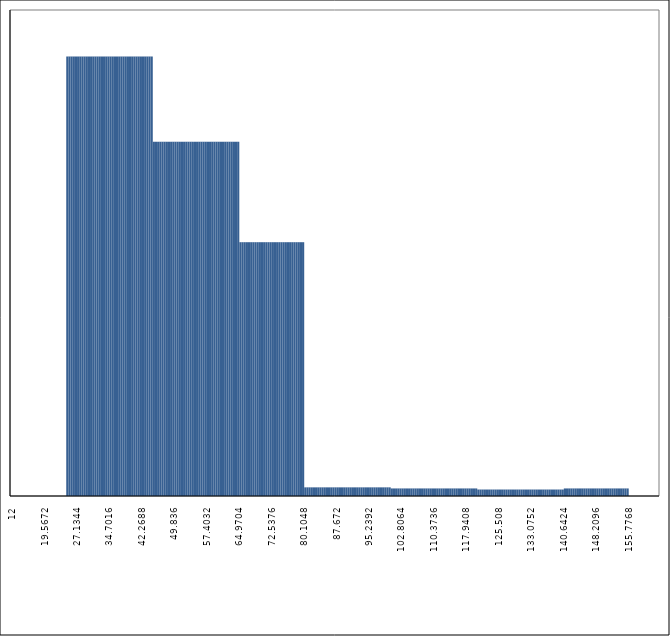
| Category | Series 0 |
|---|---|
| 12.0 | 0 |
| 12.504480000000001 | 0 |
| 13.008960000000002 | 0 |
| 13.513440000000003 | 0 |
| 14.017920000000004 | 0 |
| 14.522400000000005 | 0 |
| 15.026880000000006 | 0 |
| 15.531360000000006 | 0 |
| 16.035840000000007 | 0 |
| 16.54032000000001 | 0 |
| 17.04480000000001 | 0 |
| 17.54928000000001 | 0 |
| 18.05376000000001 | 0 |
| 18.558240000000012 | 0 |
| 19.062720000000013 | 0 |
| 19.567200000000014 | 0 |
| 20.071680000000015 | 0 |
| 20.576160000000016 | 0 |
| 21.080640000000017 | 0 |
| 21.585120000000018 | 0 |
| 22.08960000000002 | 0 |
| 22.59408000000002 | 0 |
| 23.09856000000002 | 0 |
| 23.60304000000002 | 0 |
| 24.107520000000022 | 0 |
| 24.612000000000023 | 0 |
| 25.116480000000024 | 0.407 |
| 25.620960000000025 | 0.407 |
| 26.125440000000026 | 0.407 |
| 26.629920000000027 | 0.407 |
| 27.134400000000028 | 0.407 |
| 27.63888000000003 | 0.407 |
| 28.14336000000003 | 0.407 |
| 28.64784000000003 | 0.407 |
| 29.15232000000003 | 0.407 |
| 29.656800000000032 | 0.407 |
| 30.161280000000033 | 0.407 |
| 30.665760000000034 | 0.407 |
| 31.170240000000035 | 0.407 |
| 31.674720000000036 | 0.407 |
| 32.17920000000004 | 0.407 |
| 32.68368000000004 | 0.407 |
| 33.18816000000004 | 0.407 |
| 33.69264000000004 | 0.407 |
| 34.19712000000004 | 0.407 |
| 34.70160000000004 | 0.407 |
| 35.20608000000004 | 0.407 |
| 35.710560000000044 | 0.407 |
| 36.215040000000045 | 0.407 |
| 36.719520000000045 | 0.407 |
| 37.224000000000046 | 0.407 |
| 37.72848000000005 | 0.407 |
| 38.23296000000005 | 0.407 |
| 38.73744000000005 | 0.407 |
| 39.24192000000005 | 0.407 |
| 39.74640000000005 | 0.407 |
| 40.25088000000005 | 0.407 |
| 40.75536000000005 | 0.407 |
| 41.259840000000054 | 0.407 |
| 41.764320000000055 | 0.407 |
| 42.268800000000056 | 0.407 |
| 42.77328000000006 | 0.407 |
| 43.27776000000006 | 0.407 |
| 43.78224000000006 | 0.407 |
| 44.28672000000006 | 0.407 |
| 44.79120000000006 | 0.407 |
| 45.29568000000006 | 0.328 |
| 45.80016000000006 | 0.328 |
| 46.30464000000006 | 0.328 |
| 46.809120000000064 | 0.328 |
| 47.313600000000065 | 0.328 |
| 47.818080000000066 | 0.328 |
| 48.32256000000007 | 0.328 |
| 48.82704000000007 | 0.328 |
| 49.33152000000007 | 0.328 |
| 49.83600000000007 | 0.328 |
| 50.34048000000007 | 0.328 |
| 50.84496000000007 | 0.328 |
| 51.34944000000007 | 0.328 |
| 51.85392000000007 | 0.328 |
| 52.358400000000074 | 0.328 |
| 52.862880000000075 | 0.328 |
| 53.367360000000076 | 0.328 |
| 53.87184000000008 | 0.328 |
| 54.37632000000008 | 0.328 |
| 54.88080000000008 | 0.328 |
| 55.38528000000008 | 0.328 |
| 55.88976000000008 | 0.328 |
| 56.39424000000008 | 0.328 |
| 56.89872000000008 | 0.328 |
| 57.40320000000008 | 0.328 |
| 57.907680000000084 | 0.328 |
| 58.412160000000085 | 0.328 |
| 58.916640000000086 | 0.328 |
| 59.42112000000009 | 0.328 |
| 59.92560000000009 | 0.328 |
| 60.43008000000009 | 0.328 |
| 60.93456000000009 | 0.328 |
| 61.43904000000009 | 0.328 |
| 61.94352000000009 | 0.328 |
| 62.44800000000009 | 0.328 |
| 62.952480000000094 | 0.328 |
| 63.456960000000095 | 0.328 |
| 63.961440000000096 | 0.328 |
| 64.4659200000001 | 0.328 |
| 64.9704000000001 | 0.328 |
| 65.4748800000001 | 0.235 |
| 65.9793600000001 | 0.235 |
| 66.4838400000001 | 0.235 |
| 66.9883200000001 | 0.235 |
| 67.4928000000001 | 0.235 |
| 67.9972800000001 | 0.235 |
| 68.5017600000001 | 0.235 |
| 69.0062400000001 | 0.235 |
| 69.5107200000001 | 0.235 |
| 70.0152000000001 | 0.235 |
| 70.51968000000011 | 0.235 |
| 71.02416000000011 | 0.235 |
| 71.52864000000011 | 0.235 |
| 72.03312000000011 | 0.235 |
| 72.53760000000011 | 0.235 |
| 73.04208000000011 | 0.235 |
| 73.54656000000011 | 0.235 |
| 74.05104000000011 | 0.235 |
| 74.55552000000012 | 0.235 |
| 75.06000000000012 | 0.235 |
| 75.56448000000012 | 0.235 |
| 76.06896000000012 | 0.235 |
| 76.57344000000012 | 0.235 |
| 77.07792000000012 | 0.235 |
| 77.58240000000012 | 0.235 |
| 78.08688000000012 | 0.235 |
| 78.59136000000012 | 0.235 |
| 79.09584000000012 | 0.235 |
| 79.60032000000012 | 0.235 |
| 80.10480000000013 | 0.235 |
| 80.60928000000013 | 0.008 |
| 81.11376000000013 | 0.008 |
| 81.61824000000013 | 0.008 |
| 82.12272000000013 | 0.008 |
| 82.62720000000013 | 0.008 |
| 83.13168000000013 | 0.008 |
| 83.63616000000013 | 0.008 |
| 84.14064000000013 | 0.008 |
| 84.64512000000013 | 0.008 |
| 85.14960000000013 | 0.008 |
| 85.65408000000014 | 0.008 |
| 86.15856000000014 | 0.008 |
| 86.66304000000014 | 0.008 |
| 87.16752000000014 | 0.008 |
| 87.67200000000014 | 0.008 |
| 88.17648000000014 | 0.008 |
| 88.68096000000014 | 0.008 |
| 89.18544000000014 | 0.008 |
| 89.68992000000014 | 0.008 |
| 90.19440000000014 | 0.008 |
| 90.69888000000014 | 0.008 |
| 91.20336000000015 | 0.008 |
| 91.70784000000015 | 0.008 |
| 92.21232000000015 | 0.008 |
| 92.71680000000015 | 0.008 |
| 93.22128000000015 | 0.008 |
| 93.72576000000015 | 0.008 |
| 94.23024000000015 | 0.008 |
| 94.73472000000015 | 0.008 |
| 95.23920000000015 | 0.008 |
| 95.74368000000015 | 0.008 |
| 96.24816000000015 | 0.008 |
| 96.75264000000016 | 0.008 |
| 97.25712000000016 | 0.008 |
| 97.76160000000016 | 0.008 |
| 98.26608000000016 | 0.008 |
| 98.77056000000016 | 0.008 |
| 99.27504000000016 | 0.008 |
| 99.77952000000016 | 0.008 |
| 100.28400000000016 | 0.008 |
| 100.78848000000016 | 0.007 |
| 101.29296000000016 | 0.007 |
| 101.79744000000017 | 0.007 |
| 102.30192000000017 | 0.007 |
| 102.80640000000017 | 0.007 |
| 103.31088000000017 | 0.007 |
| 103.81536000000017 | 0.007 |
| 104.31984000000017 | 0.007 |
| 104.82432000000017 | 0.007 |
| 105.32880000000017 | 0.007 |
| 105.83328000000017 | 0.007 |
| 106.33776000000017 | 0.007 |
| 106.84224000000017 | 0.007 |
| 107.34672000000018 | 0.007 |
| 107.85120000000018 | 0.007 |
| 108.35568000000018 | 0.007 |
| 108.86016000000018 | 0.007 |
| 109.36464000000018 | 0.007 |
| 109.86912000000018 | 0.007 |
| 110.37360000000018 | 0.007 |
| 110.87808000000018 | 0.007 |
| 111.38256000000018 | 0.007 |
| 111.88704000000018 | 0.007 |
| 112.39152000000018 | 0.007 |
| 112.89600000000019 | 0.007 |
| 113.40048000000019 | 0.007 |
| 113.90496000000019 | 0.007 |
| 114.40944000000019 | 0.007 |
| 114.91392000000019 | 0.007 |
| 115.41840000000019 | 0.007 |
| 115.92288000000019 | 0.007 |
| 116.42736000000019 | 0.007 |
| 116.9318400000002 | 0.007 |
| 117.4363200000002 | 0.007 |
| 117.9408000000002 | 0.007 |
| 118.4452800000002 | 0.007 |
| 118.9497600000002 | 0.007 |
| 119.4542400000002 | 0.007 |
| 119.9587200000002 | 0.007 |
| 120.4632000000002 | 0.007 |
| 120.9676800000002 | 0.006 |
| 121.4721600000002 | 0.006 |
| 121.9766400000002 | 0.006 |
| 122.4811200000002 | 0.006 |
| 122.9856000000002 | 0.006 |
| 123.4900800000002 | 0.006 |
| 123.9945600000002 | 0.006 |
| 124.4990400000002 | 0.006 |
| 125.00352000000021 | 0.006 |
| 125.50800000000021 | 0.006 |
| 126.01248000000021 | 0.006 |
| 126.51696000000021 | 0.006 |
| 127.02144000000021 | 0.006 |
| 127.52592000000021 | 0.006 |
| 128.0304000000002 | 0.006 |
| 128.53488000000021 | 0.006 |
| 129.03936000000022 | 0.006 |
| 129.54384000000022 | 0.006 |
| 130.04832000000022 | 0.006 |
| 130.55280000000022 | 0.006 |
| 131.05728000000022 | 0.006 |
| 131.56176000000022 | 0.006 |
| 132.06624000000022 | 0.006 |
| 132.57072000000022 | 0.006 |
| 133.07520000000022 | 0.006 |
| 133.57968000000022 | 0.006 |
| 134.08416000000022 | 0.006 |
| 134.58864000000023 | 0.006 |
| 135.09312000000023 | 0.006 |
| 135.59760000000023 | 0.006 |
| 136.10208000000023 | 0.006 |
| 136.60656000000023 | 0.006 |
| 137.11104000000023 | 0.006 |
| 137.61552000000023 | 0.006 |
| 138.12000000000023 | 0.006 |
| 138.62448000000023 | 0.006 |
| 139.12896000000023 | 0.006 |
| 139.63344000000023 | 0.006 |
| 140.13792000000024 | 0.006 |
| 140.64240000000024 | 0.006 |
| 141.14688000000024 | 0.007 |
| 141.65136000000024 | 0.007 |
| 142.15584000000024 | 0.007 |
| 142.66032000000024 | 0.007 |
| 143.16480000000024 | 0.007 |
| 143.66928000000024 | 0.007 |
| 144.17376000000024 | 0.007 |
| 144.67824000000024 | 0.007 |
| 145.18272000000024 | 0.007 |
| 145.68720000000025 | 0.007 |
| 146.19168000000025 | 0.007 |
| 146.69616000000025 | 0.007 |
| 147.20064000000025 | 0.007 |
| 147.70512000000025 | 0.007 |
| 148.20960000000025 | 0.007 |
| 148.71408000000025 | 0.007 |
| 149.21856000000025 | 0.007 |
| 149.72304000000025 | 0.007 |
| 150.22752000000025 | 0.007 |
| 150.73200000000026 | 0.007 |
| 151.23648000000026 | 0.007 |
| 151.74096000000026 | 0.007 |
| 152.24544000000026 | 0.007 |
| 152.74992000000026 | 0.007 |
| 153.25440000000026 | 0.007 |
| 153.75888000000026 | 0.007 |
| 154.26336000000026 | 0.007 |
| 154.76784000000026 | 0.007 |
| 155.27232000000026 | 0.007 |
| 155.77680000000026 | 0.007 |
| 156.28128000000027 | -0.998 |
| 156.78576000000027 | -0.998 |
| 157.29024000000027 | -0.998 |
| 157.79472000000027 | -0.998 |
| 158.29920000000027 | -0.998 |
| 158.80368000000027 | -0.998 |
| 159.30816000000027 | -0.998 |
| 159.81264000000027 | -0.998 |
| 160.31712000000027 | -0.998 |
| 160.82160000000027 | -0.998 |
| 161.32608000000027 | -0.998 |
| 161.83056000000028 | -0.998 |
| 162.33504000000028 | -0.998 |
| 162.83952000000028 | -0.998 |